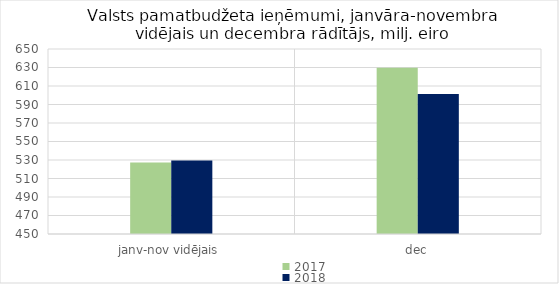
| Category | 2017 | 2018 |
|---|---|---|
| janv-nov vidējais | 527406.713 | 529418.221 |
| dec | 629644.768 | 601482.069 |